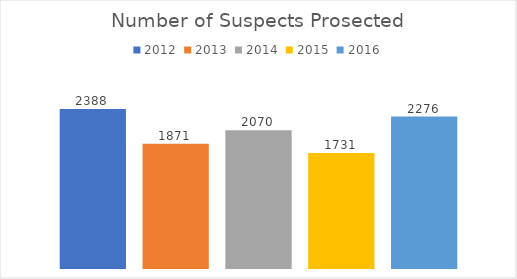
| Category | 2012 | 2013 | 2014 | 2015 | 2016 |
|---|---|---|---|---|---|
| 0 | 2388 | 1871 | 2070 | 1731 | 2276 |